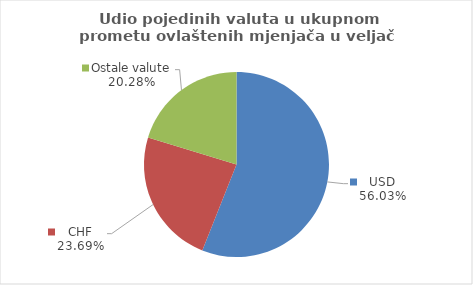
| Category | Series 0 |
|---|---|
| USD | 56.029 |
| CHF | 23.694 |
| Ostale valute | 20.277 |